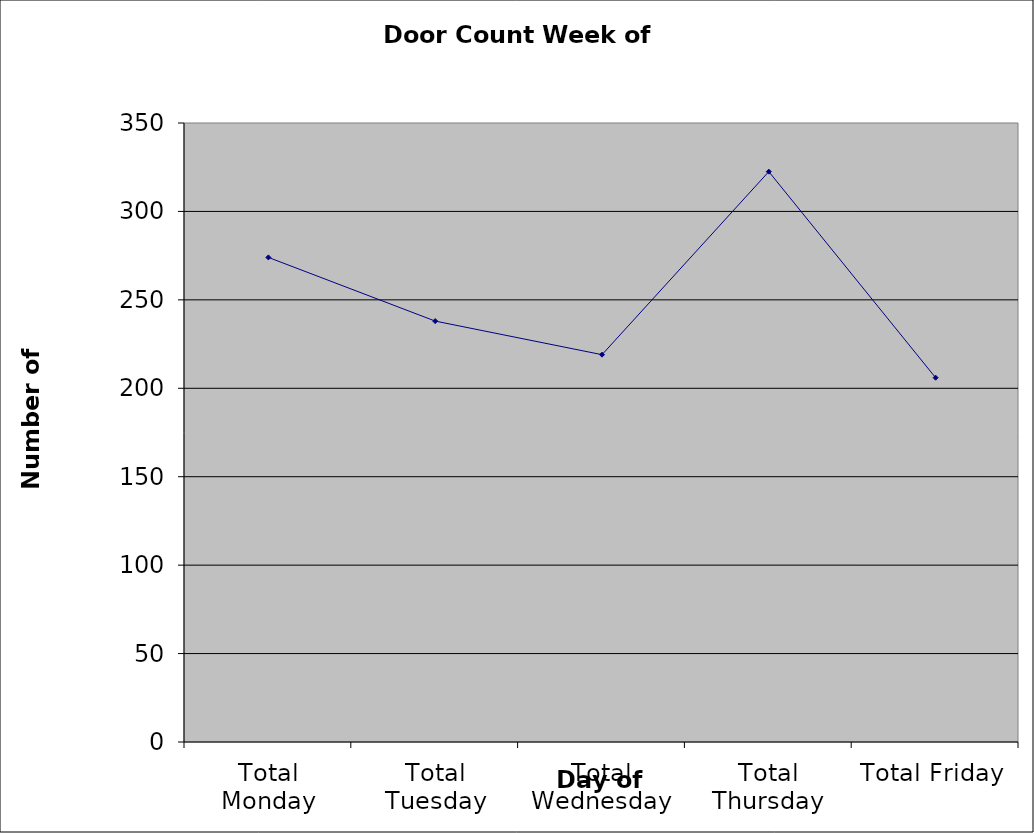
| Category | Series 0 |
|---|---|
| Total Monday | 274 |
| Total Tuesday | 238 |
| Total Wednesday | 219 |
| Total Thursday | 322.5 |
| Total Friday | 206 |